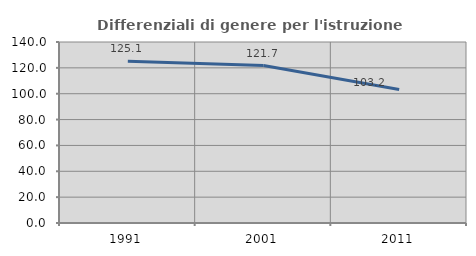
| Category | Differenziali di genere per l'istruzione superiore |
|---|---|
| 1991.0 | 125.133 |
| 2001.0 | 121.748 |
| 2011.0 | 103.234 |